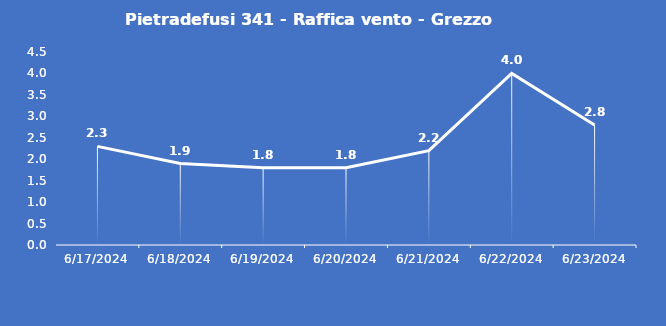
| Category | Pietradefusi 341 - Raffica vento - Grezzo (m/s) |
|---|---|
| 6/17/24 | 2.3 |
| 6/18/24 | 1.9 |
| 6/19/24 | 1.8 |
| 6/20/24 | 1.8 |
| 6/21/24 | 2.2 |
| 6/22/24 | 4 |
| 6/23/24 | 2.8 |